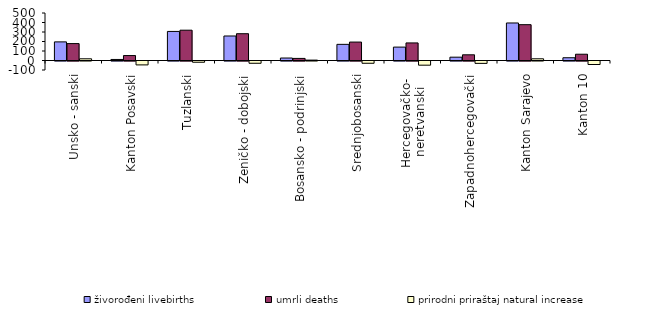
| Category | živorođeni livebirths | umrli deaths | prirodni priraštaj natural increase |
|---|---|---|---|
| Unsko - sanski | 196 | 178 | 18 |
| Kanton Posavski | 11 | 52 | -41 |
| Tuzlanski | 306 | 319 | -13 |
| Zeničko - dobojski | 258 | 282 | -24 |
| Bosansko - podrinjski | 26 | 22 | 4 |
| Srednjobosanski | 170 | 194 | -24 |
| Hercegovačko- 
neretvanski | 141 | 185 | -44 |
| Zapadnohercegovački | 35 | 60 | -25 |
| Kanton Sarajevo | 395 | 377 | 18 |
| Kanton 10 | 29 | 66 | -37 |